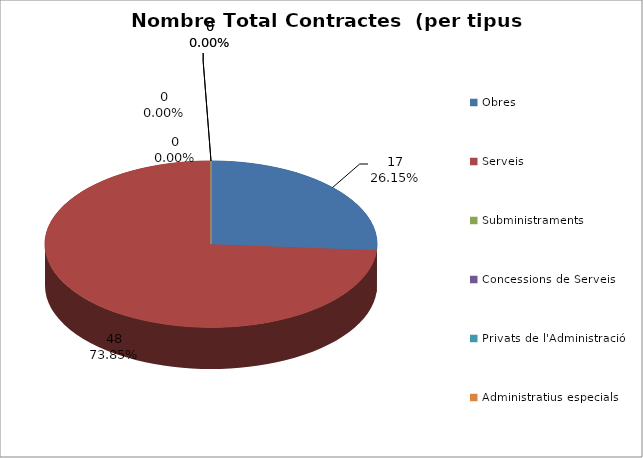
| Category | Nombre Total Contractes |
|---|---|
| Obres | 17 |
| Serveis | 48 |
| Subministraments | 0 |
| Concessions de Serveis | 0 |
| Privats de l'Administració | 0 |
| Administratius especials | 0 |